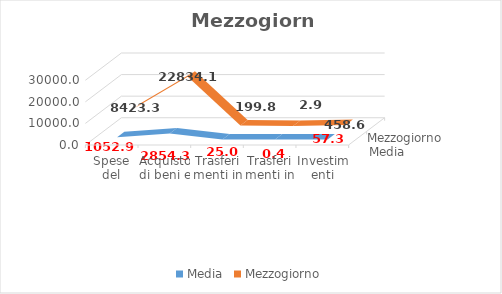
| Category | Media | Mezzogiorno |
|---|---|---|
| Spese del personale | 1052.914 | 8423.315 |
| Acquisto di beni e servizi | 2854.258 | 22834.064 |
| Trasferimenti in c/corrente | 24.971 | 199.768 |
| Trasferimenti in c/capitale | 0.364 | 2.916 |
| Investimenti | 57.324 | 458.588 |